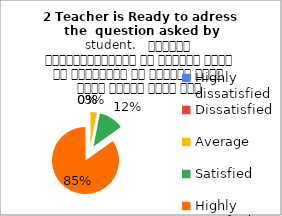
| Category | 2 Teacher is Ready to adress the  question asked by student.   शिक्षक विद्यार्थियों के द्वारा पूछे गए प्रश्नों का समाधान करने हेतु तत्पर रहते हैं |
|---|---|
| Highly dissatisfied | 0 |
| Dissatisfied | 0 |
| Average | 1 |
| Satisfied | 4 |
| Highly satisfied | 28 |